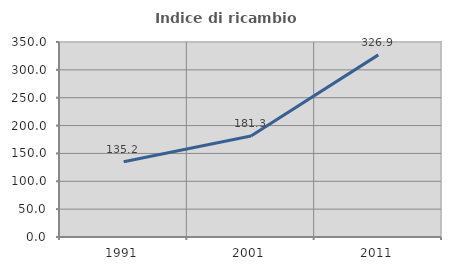
| Category | Indice di ricambio occupazionale  |
|---|---|
| 1991.0 | 135.167 |
| 2001.0 | 181.25 |
| 2011.0 | 326.897 |